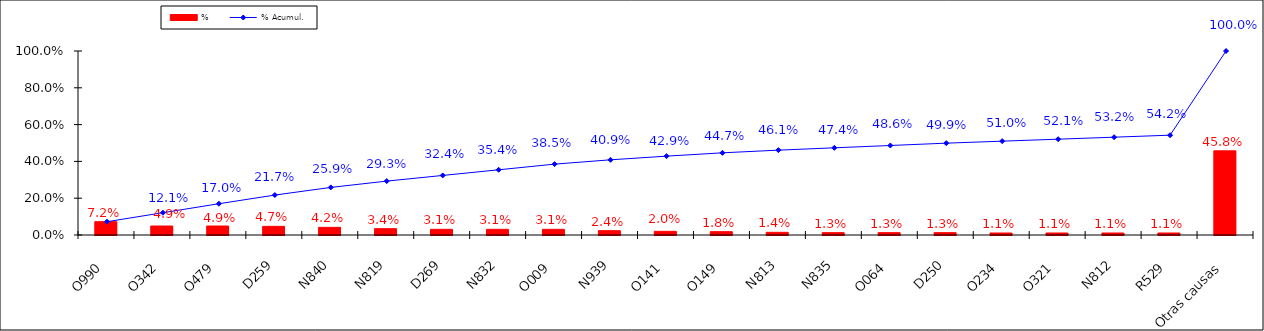
| Category | % |
|---|---|
| O990 | 0.072 |
| O342 | 0.049 |
| O479 | 0.049 |
| D259 | 0.047 |
| N840 | 0.042 |
| N819 | 0.034 |
| D269 | 0.031 |
| N832 | 0.031 |
| O009 | 0.031 |
| N939 | 0.024 |
| O141 | 0.02 |
| O149 | 0.018 |
| N813 | 0.014 |
| N835 | 0.013 |
| O064 | 0.013 |
| D250 | 0.013 |
| O234 | 0.011 |
| O321 | 0.011 |
| N812 | 0.011 |
| R529 | 0.011 |
| Otras causas | 0.458 |